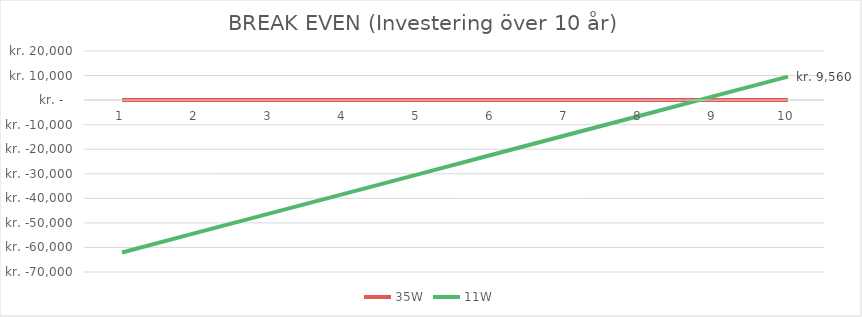
| Category | 35W | 11W | 19W Rax (on/off) | Løsning 2 |
|---|---|---|---|---|
| 0 | 0 | -62044 |  |  |
| 1 | 0 | -54088 |  |  |
| 2 | 0 | -46132 |  |  |
| 3 | 0 | -38176 |  |  |
| 4 | 0 | -30220 |  |  |
| 5 | 0 | -22264 |  |  |
| 6 | 0 | -14308 |  |  |
| 7 | 0 | -6352 |  |  |
| 8 | 0 | 1604 |  |  |
| 9 | 0 | 9560 |  |  |